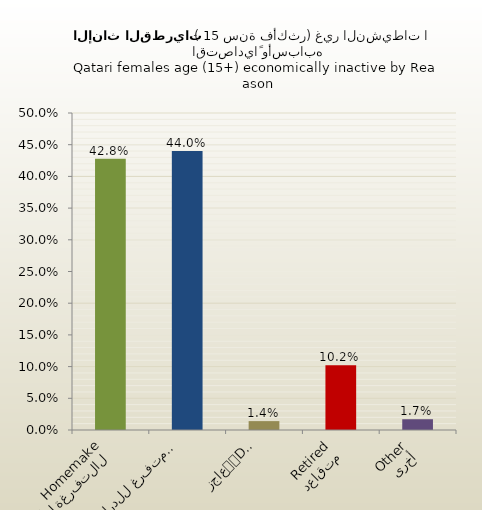
| Category | الاناث القطريات |
|---|---|
| التفرغة لأعمال المنزل
Homemaker | 0.428 |
| متفرغ للدراسة
Student | 0.44 |
| عاجز
Disabled | 0.014 |
| متقاعد
Retired | 0.102 |
| أخرى
Other | 0.017 |